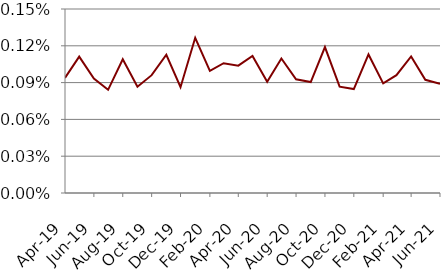
| Category | Series 0 |
|---|---|
| 2019-04-01 | 0.001 |
| 2019-05-01 | 0.001 |
| 2019-06-01 | 0.001 |
| 2019-07-01 | 0.001 |
| 2019-08-01 | 0.001 |
| 2019-09-01 | 0.001 |
| 2019-10-01 | 0.001 |
| 2019-11-01 | 0.001 |
| 2019-12-01 | 0.001 |
| 2020-01-01 | 0.001 |
| 2020-02-01 | 0.001 |
| 2020-03-01 | 0.001 |
| 2020-04-01 | 0.001 |
| 2020-05-01 | 0.001 |
| 2020-06-01 | 0.001 |
| 2020-07-01 | 0.001 |
| 2020-08-01 | 0.001 |
| 2020-09-01 | 0.001 |
| 2020-10-01 | 0.001 |
| 2020-11-01 | 0.001 |
| 2020-12-01 | 0.001 |
| 2021-01-01 | 0.001 |
| 2021-02-01 | 0.001 |
| 2021-03-01 | 0.001 |
| 2021-04-01 | 0.001 |
| 2021-05-01 | 0.001 |
| 2021-06-01 | 0.001 |